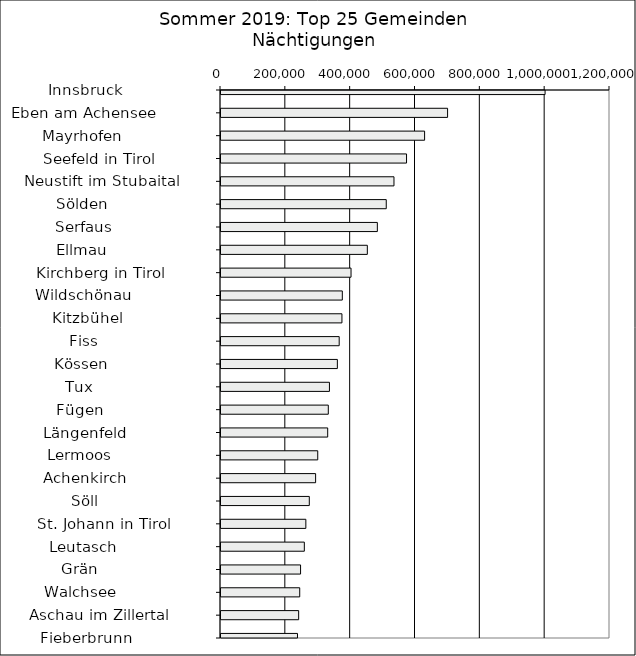
| Category | Series 0 |
|---|---|
|   Innsbruck                  | 999749 |
|   Eben am Achensee           | 698980 |
|   Mayrhofen                  | 628090 |
|   Seefeld in Tirol           | 572380 |
|   Neustift im Stubaital      | 533600 |
|   Sölden                     | 509811 |
|   Serfaus                    | 482321 |
|   Ellmau                     | 451435 |
|   Kirchberg in Tirol         | 401158 |
|   Wildschönau                | 374255 |
|   Kitzbühel                  | 373109 |
|   Fiss                       | 364617 |
|   Kössen                     | 358953 |
|   Tux                        | 334549 |
|   Fügen                      | 331023 |
|   Längenfeld                 | 329116 |
|   Lermoos                    | 298450 |
|   Achenkirch                 | 291861 |
|   Söll                       | 272420 |
|   St. Johann in Tirol        | 261733 |
|   Leutasch                   | 257092 |
|   Grän                       | 245473 |
|   Walchsee                   | 242872 |
|   Aschau im Zillertal        | 239566 |
|   Fieberbrunn                | 235975 |